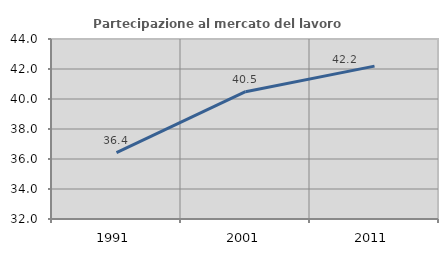
| Category | Partecipazione al mercato del lavoro  femminile |
|---|---|
| 1991.0 | 36.422 |
| 2001.0 | 40.489 |
| 2011.0 | 42.192 |